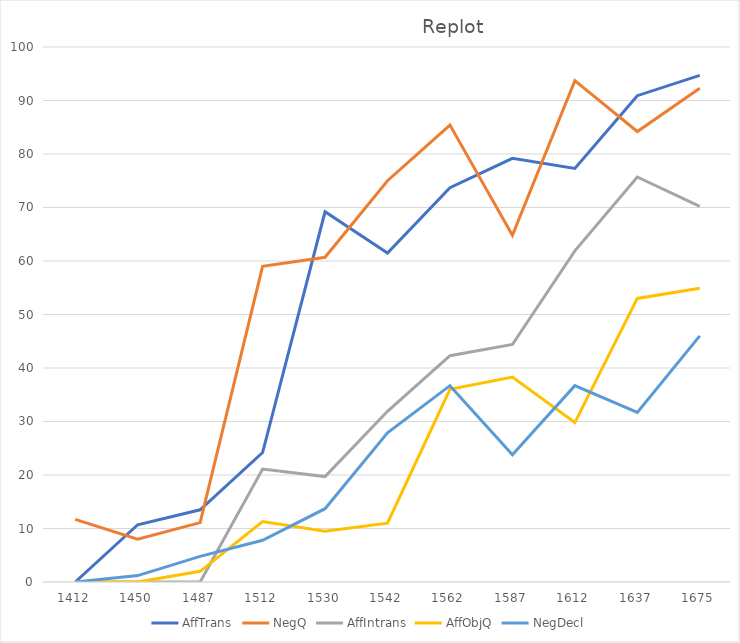
| Category | AffTrans | NegQ | AffIntrans | AffObjQ | NegDecl |
|---|---|---|---|---|---|
| 1412.0 | 0 | 11.7 | 0 | 0 | 0 |
| 1450.0 | 10.7 | 8 | 0 | 0 | 1.2 |
| 1487.0 | 13.5 | 11.1 | 0 | 2 | 4.8 |
| 1512.0 | 24.2 | 59 | 21.1 | 11.3 | 7.8 |
| 1530.0 | 69.2 | 60.7 | 19.7 | 9.5 | 13.7 |
| 1542.0 | 61.5 | 75 | 31.9 | 11 | 27.9 |
| 1562.0 | 73.7 | 85.4 | 42.3 | 36 | 36.7 |
| 1587.0 | 79.2 | 64.8 | 44.4 | 38.3 | 23.8 |
| 1612.0 | 77.3 | 93.7 | 61.9 | 29.8 | 36.7 |
| 1637.0 | 90.9 | 84.2 | 75.7 | 53 | 31.7 |
| 1675.0 | 94.7 | 92.3 | 70.2 | 54.9 | 46 |